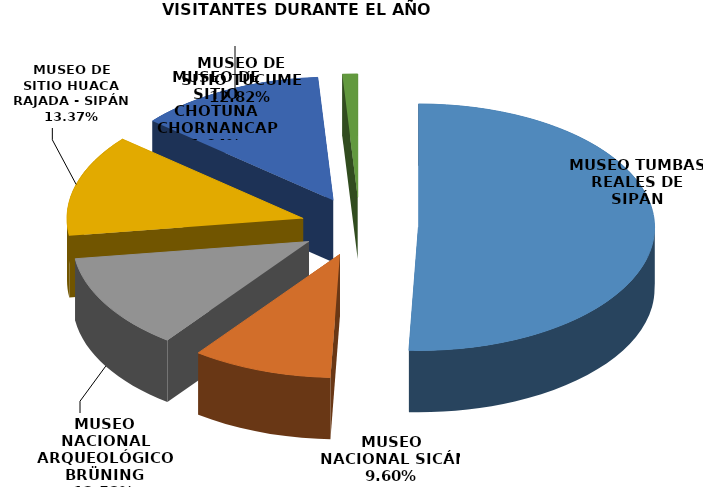
| Category | Visitantes |
|---|---|
| MUSEO TUMBAS REALES DE SIPÁN | 149755 |
| MUSEO NACIONAL SICÁN | 28388 |
| MUSEO NACIONAL ARQUEOLÓGICO BRÜNING | 37055 |
| MUSEO DE SITIO HUACA RAJADA - SIPÁN | 39534 |
| MUSEO DE SITIO TÚCUME | 37921 |
| MUSEO DE SITIO CHOTUNA CHORNANCAP | 3073 |